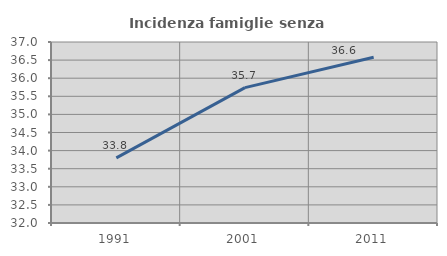
| Category | Incidenza famiglie senza nuclei |
|---|---|
| 1991.0 | 33.797 |
| 2001.0 | 35.741 |
| 2011.0 | 36.577 |